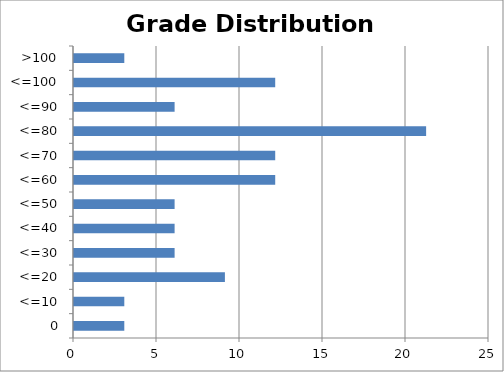
| Category | Percent |
|---|---|
| 0 | 3.03 |
| <=10 | 3.03 |
| <=20 | 9.091 |
| <=30 | 6.061 |
| <=40 | 6.061 |
| <=50 | 6.061 |
| <=60 | 12.121 |
| <=70 | 12.121 |
| <=80 | 21.212 |
| <=90 | 6.061 |
| <=100 | 12.121 |
| >100 | 3.03 |